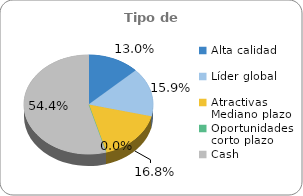
| Category | Series 0 |
|---|---|
| Alta calidad | 0.13 |
| Líder global | 0.159 |
| Atractivas Mediano plazo | 0.168 |
| Oportunidades corto plazo | 0 |
| Cash | 0.544 |